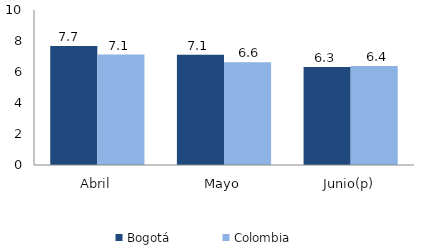
| Category | Bogotá | Colombia |
|---|---|---|
| Abril | 7.67 | 7.126 |
| Mayo | 7.109 | 6.625 |
| Junio(p) | 6.322 | 6.393 |